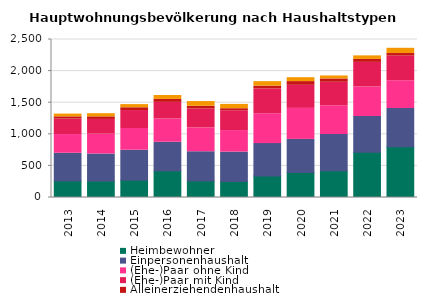
| Category | Heimbewohner | Einpersonenhaushalt | (Ehe-)Paar ohne Kind | (Ehe-)Paar mit Kind | Alleinerziehendenhaushalt | sonstiger Mehrpersonenhaushalt |
|---|---|---|---|---|---|---|
| 2013.0 | 263 | 437 | 296 | 245 | 35 | 44 |
| 2014.0 | 260 | 428 | 314 | 233 | 41 | 50 |
| 2015.0 | 275 | 473 | 344 | 284 | 44 | 50 |
| 2016.0 | 422 | 452 | 368 | 263 | 47 | 62 |
| 2017.0 | 263 | 461 | 377 | 299 | 44 | 74 |
| 2018.0 | 254 | 464 | 341 | 314 | 32 | 68 |
| 2019.0 | 341 | 512 | 473 | 392 | 44 | 71 |
| 2020.0 | 395 | 524 | 491 | 365 | 59 | 62 |
| 2021.0 | 422 | 575 | 455 | 371 | 53 | 47 |
| 2022.0 | 716 | 566 | 467 | 389 | 47 | 56 |
| 2023.0 | 803 | 605 | 440 | 389 | 41 | 83 |